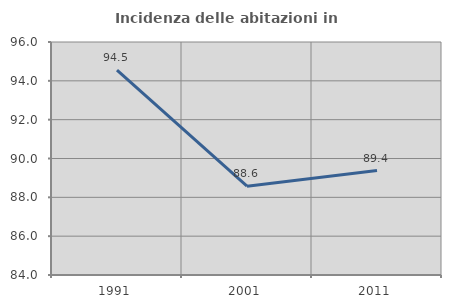
| Category | Incidenza delle abitazioni in proprietà  |
|---|---|
| 1991.0 | 94.545 |
| 2001.0 | 88.571 |
| 2011.0 | 89.381 |